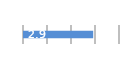
| Category | Series 0 |
|---|---|
| 0 | 2.925 |